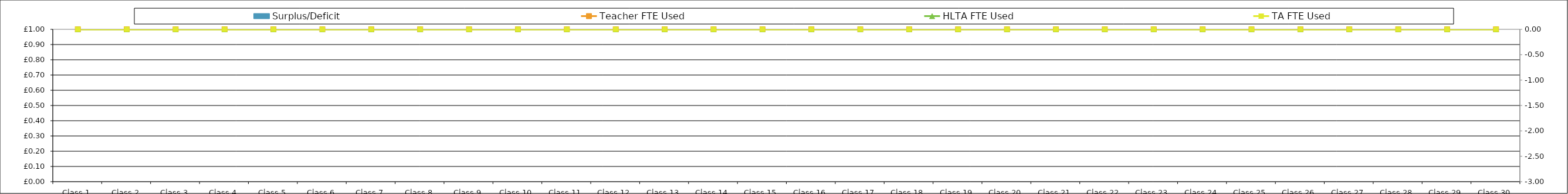
| Category | Surplus/Deficit |
|---|---|
| Class 1 | 0 |
| Class 2 | 0 |
| Class 3 | 0 |
| Class 4 | 0 |
| Class 5 | 0 |
| Class 6 | 0 |
| Class 7 | 0 |
| Class 8 | 0 |
| Class 9 | 0 |
| Class 10 | 0 |
| Class 11 | 0 |
| Class 12 | 0 |
| Class 13 | 0 |
| Class 14 | 0 |
| Class 15 | 0 |
| Class 16 | 0 |
| Class 17 | 0 |
| Class 18 | 0 |
| Class 19 | 0 |
| Class 20 | 0 |
| Class 21 | 0 |
| Class 22 | 0 |
| Class 23 | 0 |
| Class 24 | 0 |
| Class 25 | 0 |
| Class 26 | 0 |
| Class 27 | 0 |
| Class 28 | 0 |
| Class 29 | 0 |
| Class 30 | 0 |